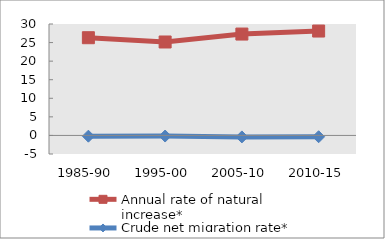
| Category | Annual rate of natural increase* | Crude net migration rate* |
|---|---|---|
| 1985-90 | 26.308 | -0.204 |
| 1995-00 | 25.156 | -0.164 |
| 2005-10 | 27.293 | -0.401 |
| 2010-15 | 28.104 | -0.35 |